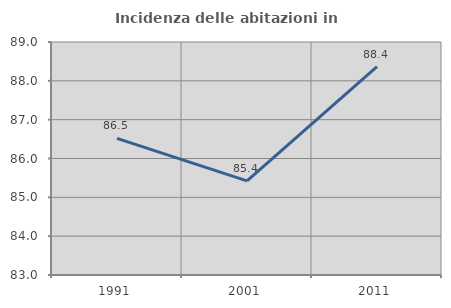
| Category | Incidenza delle abitazioni in proprietà  |
|---|---|
| 1991.0 | 86.517 |
| 2001.0 | 85.424 |
| 2011.0 | 88.365 |